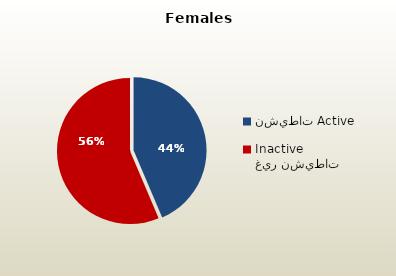
| Category | الاناث القطريات  Qatari Females |
|---|---|
| نشيطات Active | 50836 |
| غير نشيطات Inactive | 65801 |